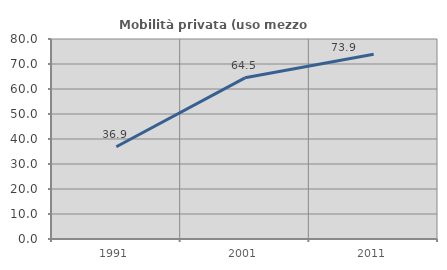
| Category | Mobilità privata (uso mezzo privato) |
|---|---|
| 1991.0 | 36.905 |
| 2001.0 | 64.471 |
| 2011.0 | 73.871 |